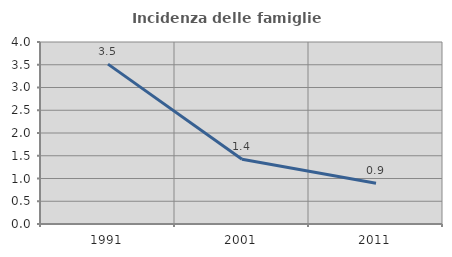
| Category | Incidenza delle famiglie numerose |
|---|---|
| 1991.0 | 3.514 |
| 2001.0 | 1.422 |
| 2011.0 | 0.893 |